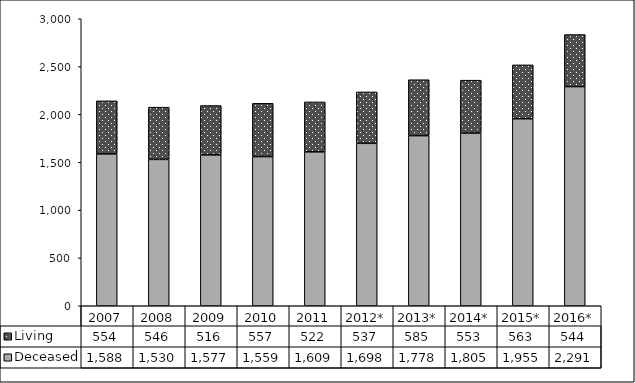
| Category | Deceased | Living |
|---|---|---|
| 2007 | 1588 | 554 |
| 2008 | 1530 | 546 |
| 2009 | 1577 | 516 |
| 2010 | 1559 | 557 |
| 2011 | 1609 | 522 |
| 2012* | 1698 | 537 |
| 2013* | 1778 | 585 |
| 2014* | 1805 | 553 |
| 2015* | 1955 | 563 |
| 2016* | 2291 | 544 |